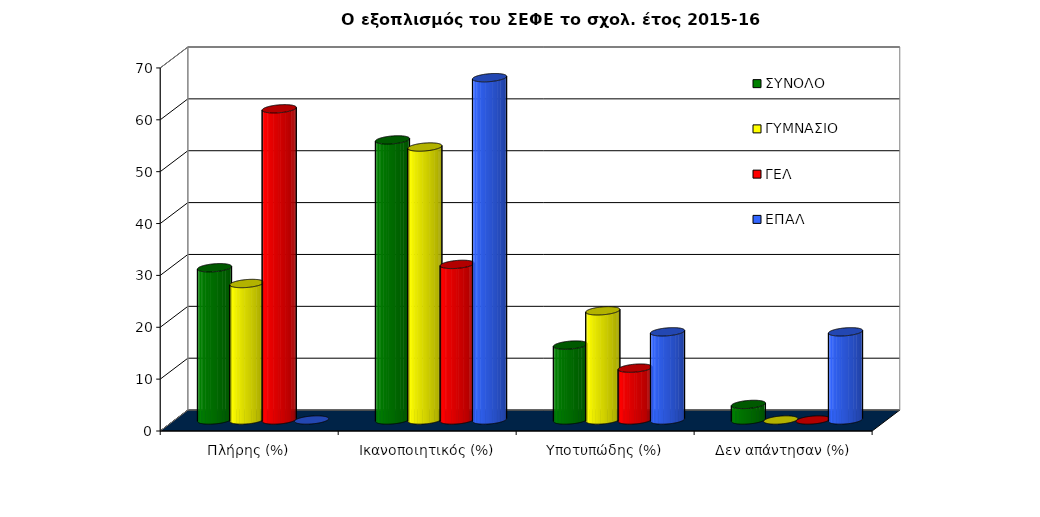
| Category | ΣΥΝΟΛΟ | ΓΥΜΝΑΣΙΟ | ΓΕΛ | ΕΠΑΛ |
|---|---|---|---|---|
| Πλήρης (%) | 29.353 | 26.316 | 60 | 0 |
| Ικανοποιητικός (%) | 54 | 52.632 | 30 | 66 |
| Υποτυπώδης (%) | 14.447 | 21.053 | 10 | 17 |
| Δεν απάντησαν (%) | 3 | 0 | 0 | 17 |